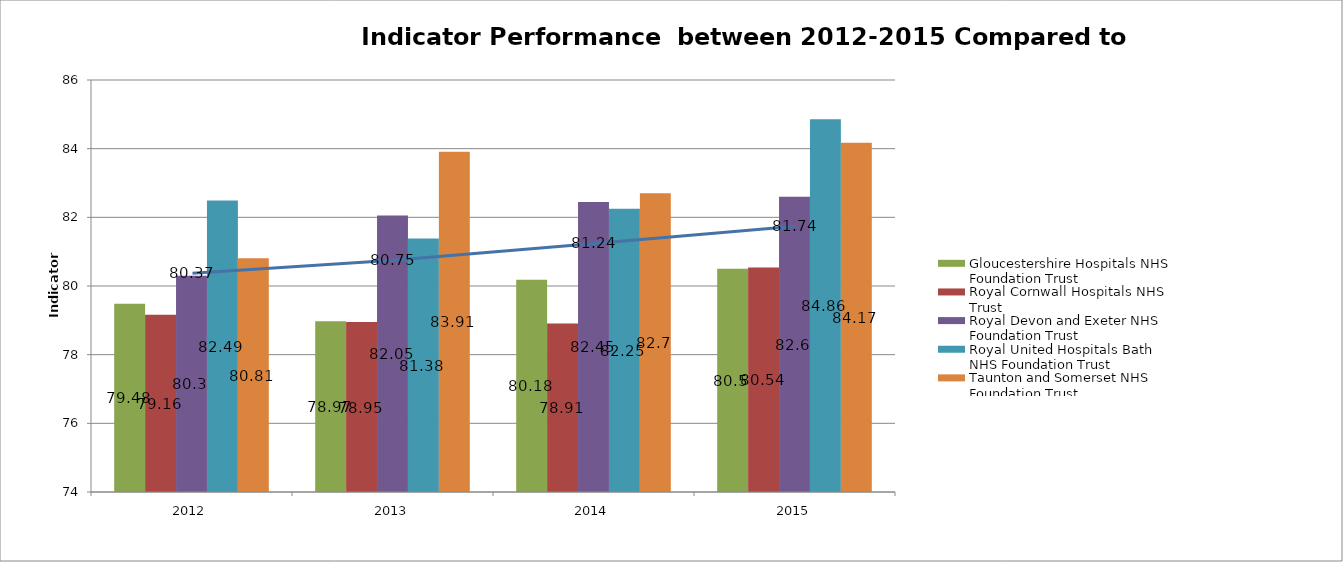
| Category | Gloucestershire Hospitals NHS Foundation Trust | Royal Cornwall Hospitals NHS Trust | Royal Devon and Exeter NHS Foundation Trust | Royal United Hospitals Bath NHS Foundation Trust | Taunton and Somerset NHS Foundation Trust |
|---|---|---|---|---|---|
| 2012 | 79.48 | 79.16 | 80.3 | 82.49 | 80.81 |
| 2013 | 78.97 | 78.95 | 82.05 | 81.38 | 83.91 |
| 2014 | 80.18 | 78.91 | 82.45 | 82.25 | 82.7 |
| 2015 | 80.5 | 80.54 | 82.6 | 84.86 | 84.17 |